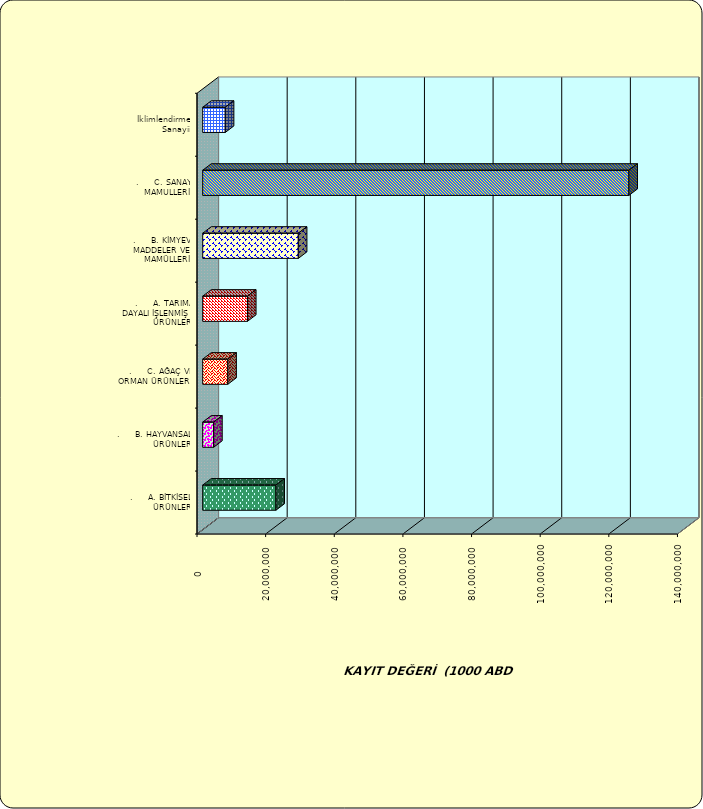
| Category | Series 0 |
|---|---|
| .     A. BİTKİSEL ÜRÜNLER | 21331690.033 |
| .     B. HAYVANSAL ÜRÜNLER | 3180606.995 |
| .     C. AĞAÇ VE ORMAN ÜRÜNLERİ | 7309598.793 |
| .     A. TARIMA DAYALI İŞLENMİŞ ÜRÜNLER | 13039045.827 |
| .     B. KİMYEVİ MADDELER VE MAMÜLLERİ | 27862297.136 |
| .     C. SANAYİ MAMULLERİ | 124181945.643 |
|  İklimlendirme Sanayii | 6574551.413 |